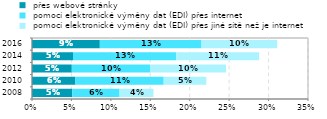
| Category |  přes webové stránky |  pomocí elektronické výměny dat (EDI) přes internet |  pomocí elektronické výměny dat (EDI) přes jiné sítě než je internet |
|---|---|---|---|
| 2008.0 | 0.051 | 0.06 | 0.043 |
| 2010.0 | 0.055 | 0.112 | 0.054 |
| 2012.0 | 0.05 | 0.099 | 0.096 |
| 2014.0 | 0.052 | 0.131 | 0.105 |
| 2016.0 | 0.086 | 0.129 | 0.096 |